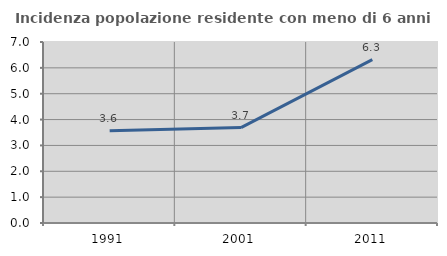
| Category | Incidenza popolazione residente con meno di 6 anni |
|---|---|
| 1991.0 | 3.571 |
| 2001.0 | 3.689 |
| 2011.0 | 6.32 |